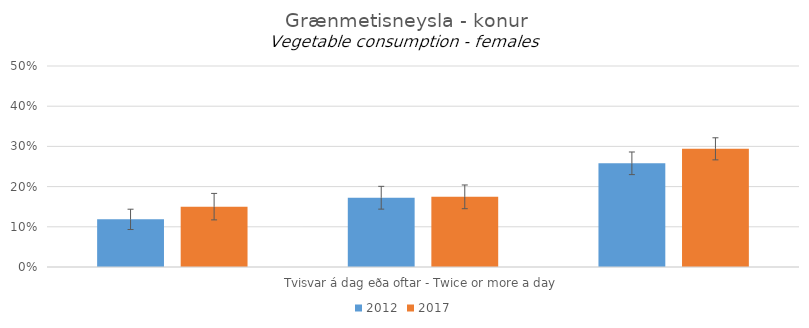
| Category | 2012 | 2017 |
|---|---|---|
| 0 | 0.118 | 0.15 |
| 1 | 0.172 | 0.175 |
| 2 | 0.258 | 0.294 |